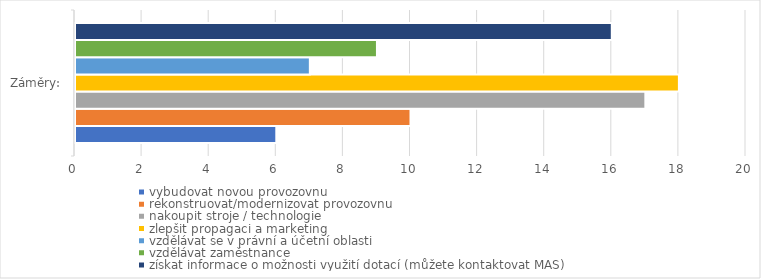
| Category | vybudovat novou provozovnu | rekonstruovat/modernizovat provozovnu | nakoupit stroje / technologie | zlepšit propagaci a marketing | vzdělávat se v právní a účetní oblasti | vzdělávat zaměstnance | získat informace o možnosti využití dotací (můžete kontaktovat MAS) |
|---|---|---|---|---|---|---|---|
| 0 | 6 | 10 | 17 | 18 | 7 | 9 | 16 |